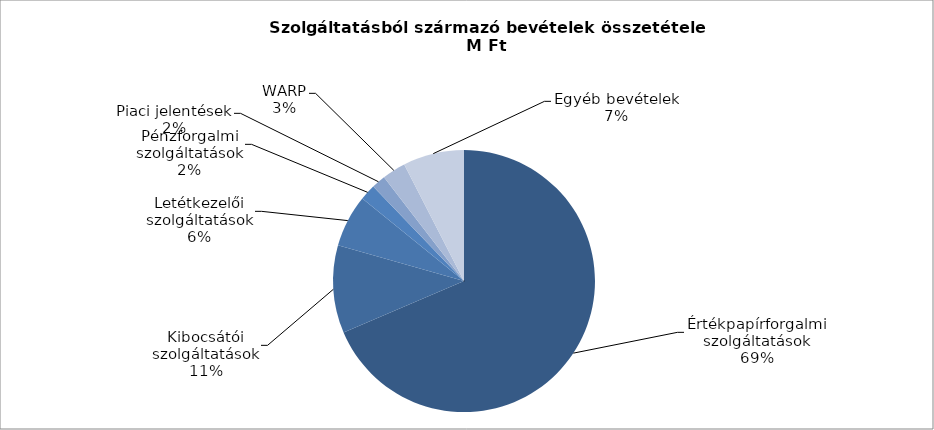
| Category | Series 0 |
|---|---|
| Értékpapírforgalmi szolgáltatások | 3331.4 |
| Kibocsátói szolgáltatások | 526.4 |
| Letétkezelői szolgáltatások | 313.6 |
| Pénzforgalmi szolgáltatások | 95.1 |
| Piaci jelentések | 84.2 |
| WARP | 141.4 |
| Egyéb bevételek | 366.5 |